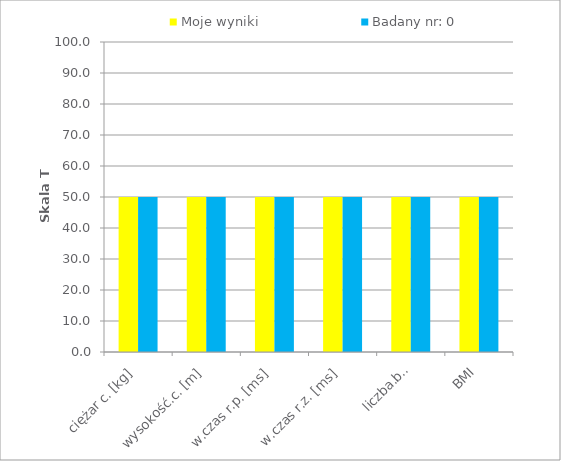
| Category | Moje wyniki | Badany nr: 0 |
|---|---|---|
| ciężar c. [kg] | 50 | 50 |
| wysokość.c. [m] | 50 | 50 |
| w.czas r.p. [ms] | 50 | 50 |
| w.czas r.z. [ms] | 50 | 50 |
| liczba.bł. | 50 | 50 |
| BMI | 50 | 50 |